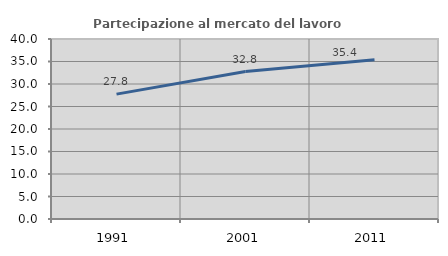
| Category | Partecipazione al mercato del lavoro  femminile |
|---|---|
| 1991.0 | 27.753 |
| 2001.0 | 32.769 |
| 2011.0 | 35.389 |